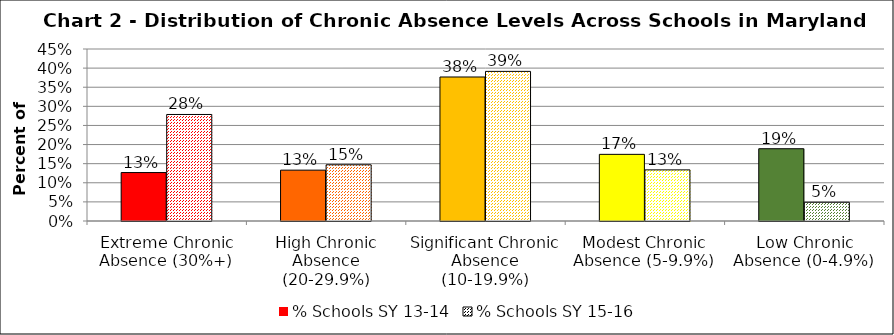
| Category | % Schools SY 13-14 | % Schools SY 15-16 |
|---|---|---|
| Extreme Chronic Absence (30%+) | 0.127 | 0.279 |
| High Chronic Absence (20-29.9%) | 0.133 | 0.147 |
| Significant Chronic Absence (10-19.9%) | 0.377 | 0.391 |
| Modest Chronic Absence (5-9.9%) | 0.174 | 0.134 |
| Low Chronic Absence (0-4.9%) | 0.189 | 0.049 |